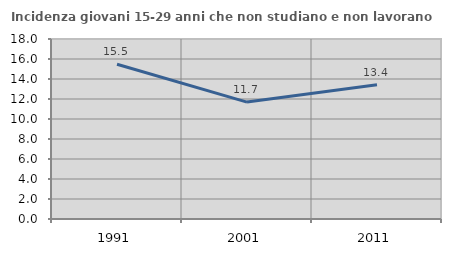
| Category | Incidenza giovani 15-29 anni che non studiano e non lavorano  |
|---|---|
| 1991.0 | 15.478 |
| 2001.0 | 11.693 |
| 2011.0 | 13.436 |